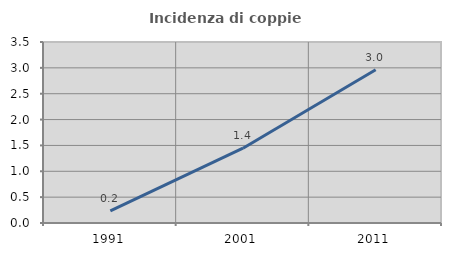
| Category | Incidenza di coppie miste |
|---|---|
| 1991.0 | 0.233 |
| 2001.0 | 1.447 |
| 2011.0 | 2.964 |